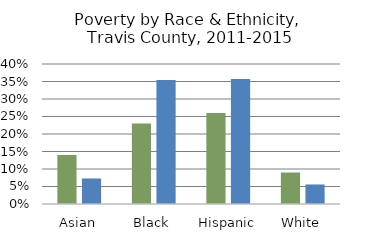
| Category | % poverty | % child poverty |
|---|---|---|
| Asian | 0.14 | 0.073 |
| Black | 0.23 | 0.354 |
| Hispanic | 0.26 | 0.357 |
| White | 0.09 | 0.056 |